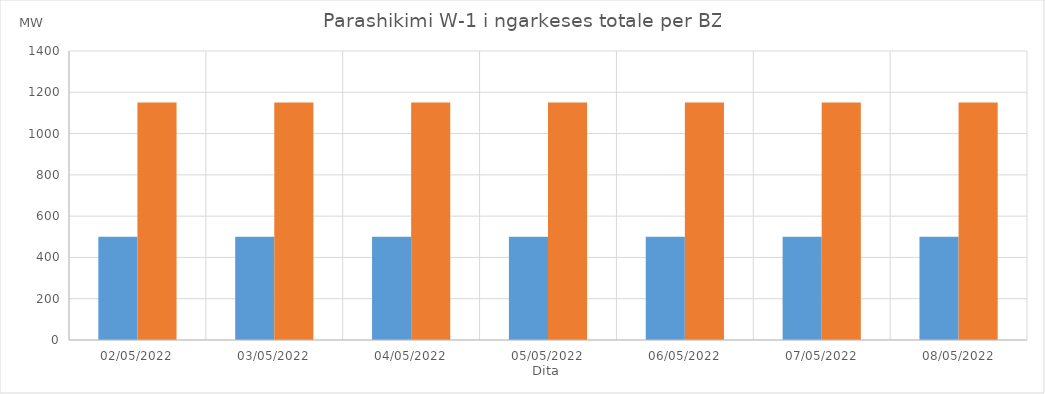
| Category | Min (MW) | Max (MW) |
|---|---|---|
| 02/05/2022 | 500 | 1150 |
| 03/05/2022 | 500 | 1150 |
| 04/05/2022 | 500 | 1150 |
| 05/05/2022 | 500 | 1150 |
| 06/05/2022 | 500 | 1150 |
| 07/05/2022 | 500 | 1150 |
| 08/05/2022 | 500 | 1150 |